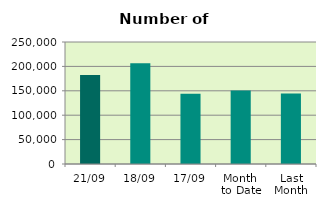
| Category | Series 0 |
|---|---|
| 21/09 | 182194 |
| 18/09 | 206240 |
| 17/09 | 143826 |
| Month 
to Date | 150613.333 |
| Last
Month | 144368.095 |